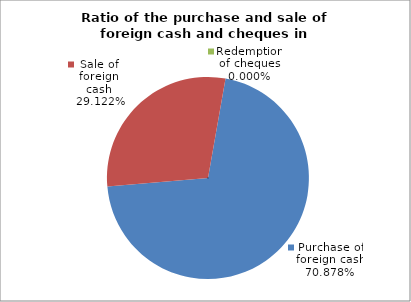
| Category | Purchase of foreign cash |
|---|---|
| 0 | 0.709 |
| 1 | 0.291 |
| 2 | 0 |